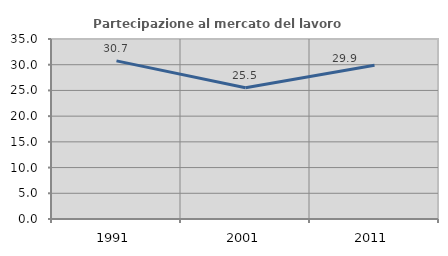
| Category | Partecipazione al mercato del lavoro  femminile |
|---|---|
| 1991.0 | 30.742 |
| 2001.0 | 25.524 |
| 2011.0 | 29.883 |